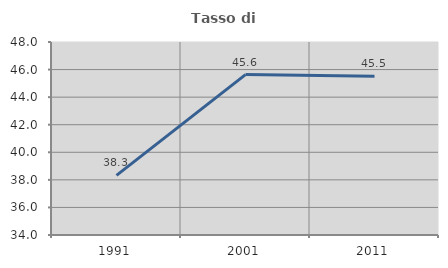
| Category | Tasso di occupazione   |
|---|---|
| 1991.0 | 38.323 |
| 2001.0 | 45.638 |
| 2011.0 | 45.522 |